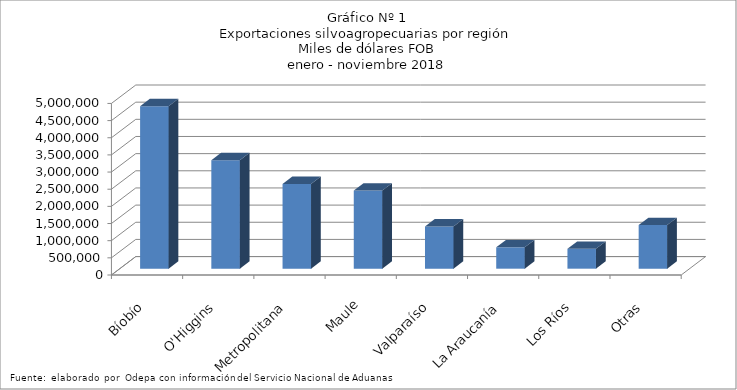
| Category | Series 0 |
|---|---|
| Bíobío | 4736085.13 |
| O'Higgins | 3162315.457 |
| Metropolitana | 2471038.815 |
| Maule | 2275982.698 |
| Valparaíso | 1230112.866 |
| La Araucanía | 622912.155 |
| Los Ríos | 580286.859 |
| Otras | 1271149.279 |